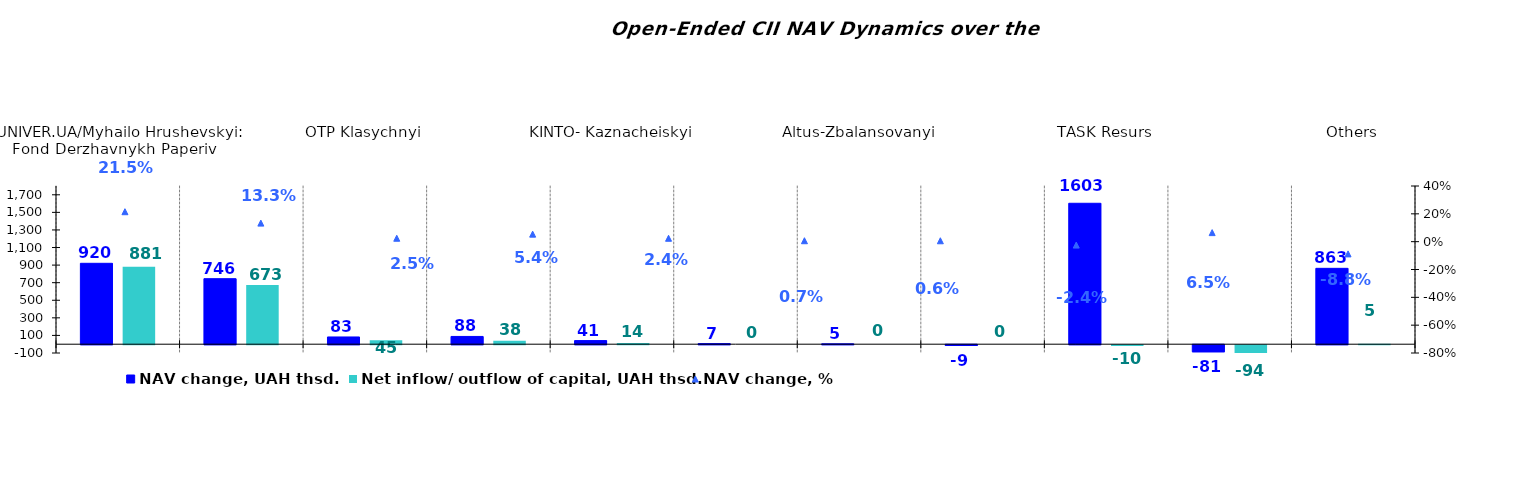
| Category | NAV change, UAH thsd. | Net inflow/ outflow of capital, UAH thsd. |
|---|---|---|
| UNIVER.UA/Myhailo Hrushevskyi: Fond Derzhavnykh Paperiv    | 920.48 | 880.788 |
| ОТP Fond Aktsii | 745.509 | 672.986 |
| ОТP Klasychnyi | 82.502 | 45.491 |
| VSI | 88.414 | 38.097 |
| KINTO- Kaznacheiskyi | 41.037 | 13.794 |
| UNIVER.UA/Taras Shevchenko: Fond Zaoshchadzhen | 6.734 | 0 |
| Altus-Zbalansovanyi | 4.544 | 0 |
| UNIVER.UA/Iaroslav Mudryi: Fond Aktsii | -9.106 | 0 |
| ТАSK Resurs | 1603.489 | -9.506 |
| Nadbannia | -80.688 | -94.249 |
| Others | 863.196 | 5.323 |